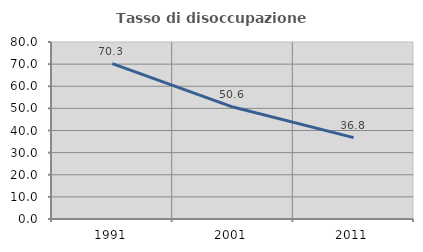
| Category | Tasso di disoccupazione giovanile  |
|---|---|
| 1991.0 | 70.251 |
| 2001.0 | 50.602 |
| 2011.0 | 36.782 |